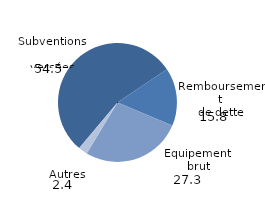
| Category | Series 0 |
|---|---|
| 0 | 54.475 |
| 1 | 15.758 |
| 2 | 27.317 |
| 3 | 2.449 |